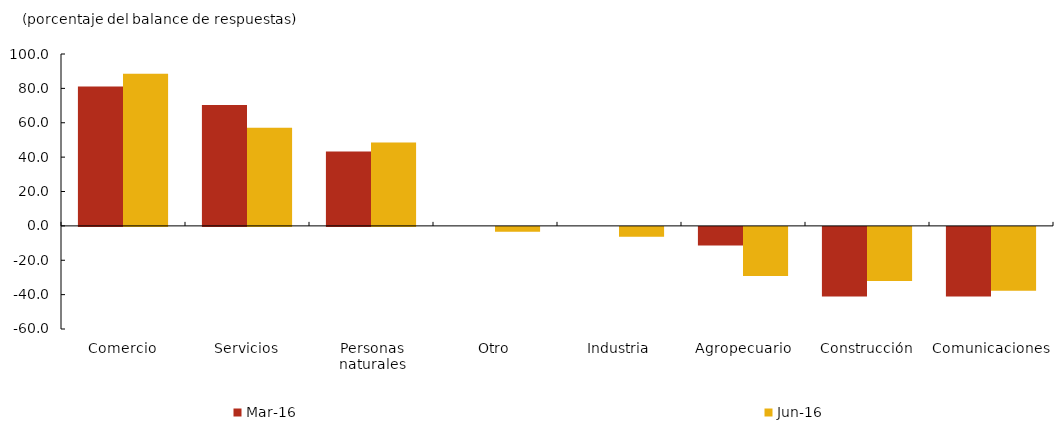
| Category | mar-16 | jun-16 |
|---|---|---|
| Comercio | 81.081 | 88.571 |
| Servicios | 70.27 | 57.143 |
| Personas naturales | 43.243 | 48.571 |
| Otro | 0 | -2.857 |
| Industria | 0 | -5.714 |
| Agropecuario | -10.811 | -28.571 |
| Construcción | -40.541 | -31.429 |
| Comunicaciones | -40.541 | -37.143 |